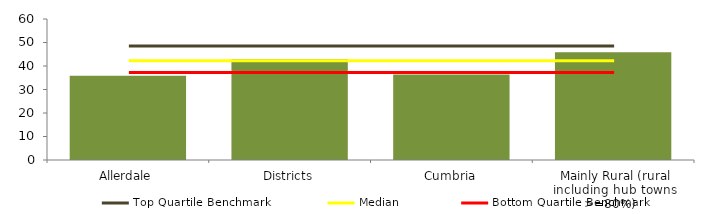
| Category | Block Data |
|---|---|
| Allerdale | 35.8 |
| Districts | 42.907 |
| Cumbria | 36.433 |
|  Mainly Rural (rural including hub towns >=80%)   | 45.868 |